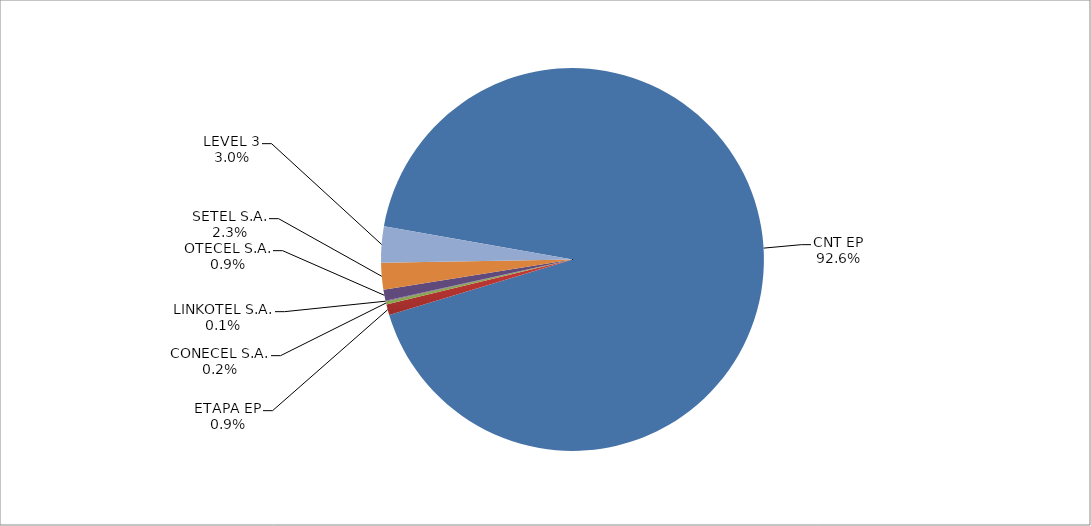
| Category | Series 0 |
|---|---|
| CNT EP | 2671 |
| ETAPA EP | 26 |
| CONECEL S.A. | 7 |
| LINKOTEL S.A. | 2 |
| OTECEL S.A. | 27 |
| SETEL S.A. | 65 |
| LEVEL 3 | 88 |